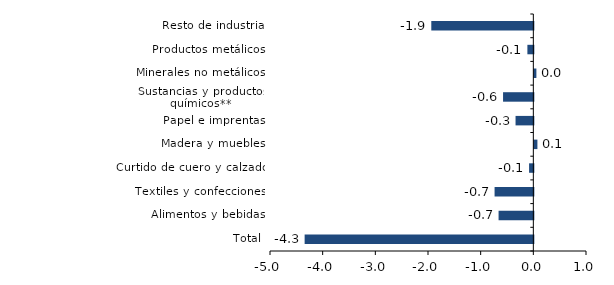
| Category | Series 0 |
|---|---|
| Total | -4.342 |
| Alimentos y bebidas | -0.66 |
| Textiles y confecciones | -0.736 |
| Curtido de cuero y calzado | -0.081 |
| Madera y muebles | 0.058 |
| Papel e imprentas | -0.338 |
| Sustancias y productos químicos** | -0.575 |
| Minerales no metálicos | 0.039 |
| Productos metálicos | -0.113 |
| Resto de industria | -1.937 |